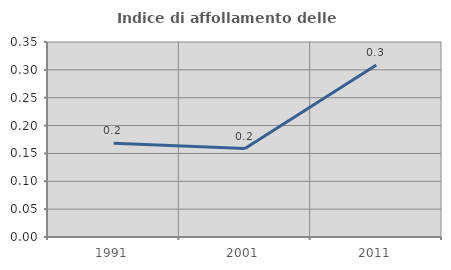
| Category | Indice di affollamento delle abitazioni  |
|---|---|
| 1991.0 | 0.168 |
| 2001.0 | 0.159 |
| 2011.0 | 0.309 |